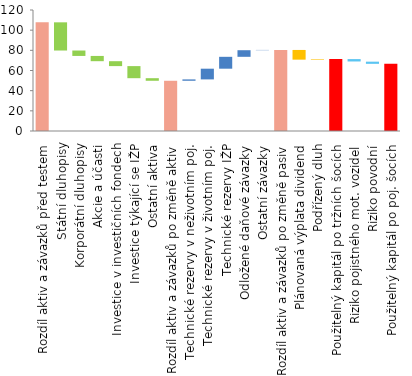
| Category | Series 0 | Series 1 |
|---|---|---|
| Rozdíl aktiv a závazků před testem | 107.78 | 0 |
| Státní dluhopisy | 79.81 | 27.96 |
| Korporátní dluhopisy | 74.44 | 5.37 |
| Akcie a účasti | 69.23 | 5.21 |
| Investice v investičních fondech | 64.36 | 4.87 |
| Investice týkající se IŽP | 52.37 | 11.99 |
| Ostatní aktiva | 49.81 | 2.56 |
| Rozdíl aktiv a závazků po změně aktiv | 0 | 49.81 |
| Technické rezervy v neživotním poj. | 49.81 | 1.36 |
| Technické rezervy v životním poj. | 51.17 | 10.62 |
| Technické rezervy IŽP | 61.79 | 11.78 |
| Odložené daňové závazky | 73.57 | 6.55 |
| Ostatní závazky | 80.13 | 0.26 |
| Rozdíl aktiv a závazků po změně pasiv | 0 | 80.39 |
| Plánovaná výplata dividend | 70.75 | 9.63 |
| Podřízený dluh | 70.75 | 0.56 |
| Použitelný kapitál po tržních šocích | 0 | 71.31 |
| Riziko pojistného mot. vozidel | 68.95 | 2.36 |
| Riziko povodní | 66.6 | 2.16 |
| Použitelný kapitál po poj. šocích | 0 | 66.6 |